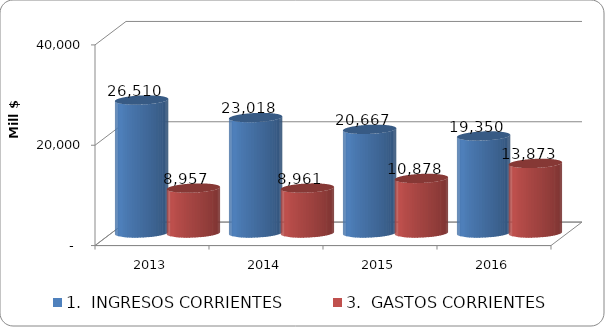
| Category | 1.  INGRESOS CORRIENTES | 3.  GASTOS CORRIENTES |
|---|---|---|
| 2013.0 | 26509.94 | 8956.752 |
| 2014.0 | 23018.422 | 8960.961 |
| 2015.0 | 20666.992 | 10877.89 |
| 2016.0 | 19349.99 | 13872.552 |